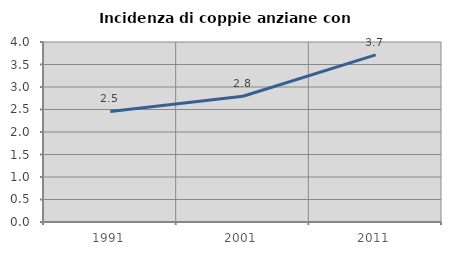
| Category | Incidenza di coppie anziane con figli |
|---|---|
| 1991.0 | 2.458 |
| 2001.0 | 2.795 |
| 2011.0 | 3.714 |